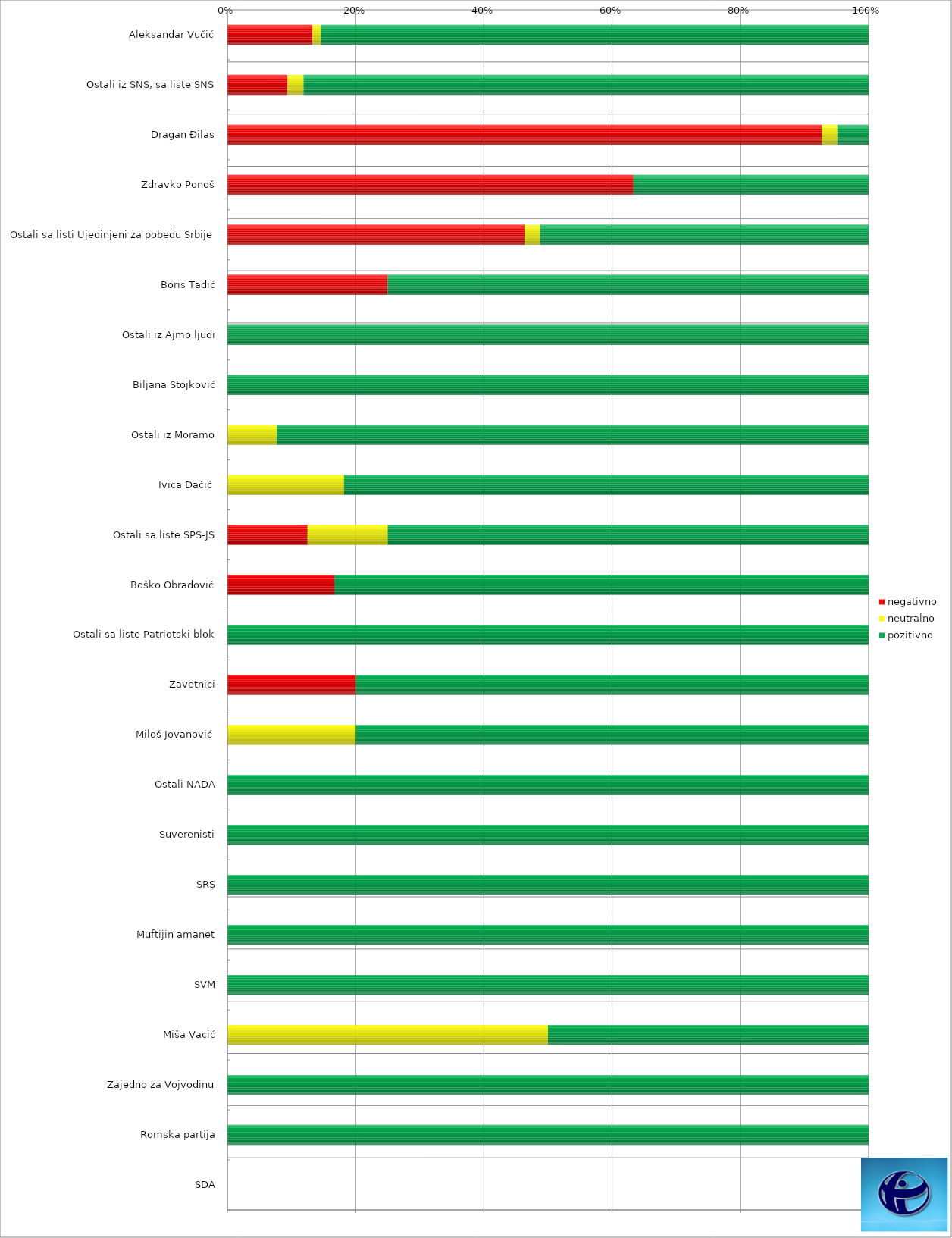
| Category | negativno | neutralno | pozitivno |
|---|---|---|---|
| Aleksandar Vučić | 41 | 4 | 264 |
| Ostali iz SNS, sa liste SNS | 15 | 4 | 141 |
| Dragan Đilas | 38 | 1 | 2 |
| Zdravko Ponoš | 19 | 0 | 11 |
| Ostali sa listi Ujedinjeni za pobedu Srbije | 19 | 1 | 21 |
| Boris Tadić | 3 | 0 | 9 |
| Ostali iz Ajmo ljudi | 0 | 0 | 9 |
| Biljana Stojković | 0 | 0 | 7 |
| Ostali iz Moramo | 0 | 1 | 12 |
| Ivica Dačić  | 0 | 2 | 9 |
| Ostali sa liste SPS-JS | 1 | 1 | 6 |
| Boško Obradović | 1 | 0 | 5 |
| Ostali sa liste Patriotski blok | 0 | 0 | 1 |
| Zavetnici | 1 | 0 | 4 |
| Miloš Jovanović  | 0 | 1 | 4 |
| Ostali NADA | 0 | 0 | 1 |
| Suverenisti | 0 | 0 | 7 |
| SRS | 0 | 0 | 2 |
| Muftijin amanet | 0 | 0 | 2 |
| SVM | 0 | 0 | 2 |
| Miša Vacić | 0 | 1 | 1 |
| Zajedno za Vojvodinu | 0 | 0 | 1 |
| Romska partija | 0 | 0 | 1 |
| SDA | 0 | 0 | 0 |